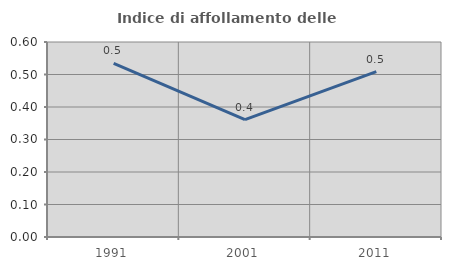
| Category | Indice di affollamento delle abitazioni  |
|---|---|
| 1991.0 | 0.534 |
| 2001.0 | 0.361 |
| 2011.0 | 0.509 |